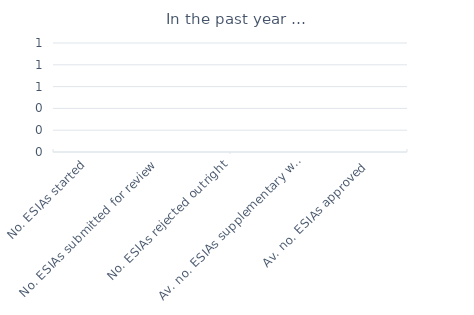
| Category | Series 0 |
|---|---|
| No. ESIAs started | 0 |
| No. ESIAs submitted for review | 0 |
| No. ESIAs rejected outright | 0 |
| Av. no. ESIAs supplementary work  required | 0 |
| Av. no. ESIAs approved  | 0 |